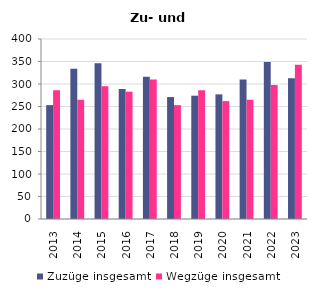
| Category | Zuzüge insgesamt | Wegzüge insgesamt |
|---|---|---|
| 2013.0 | 253 | 286 |
| 2014.0 | 334 | 265 |
| 2015.0 | 346 | 295 |
| 2016.0 | 289 | 283 |
| 2017.0 | 316 | 310 |
| 2018.0 | 271 | 253 |
| 2019.0 | 274 | 286 |
| 2020.0 | 277 | 262 |
| 2021.0 | 310 | 265 |
| 2022.0 | 349 | 298 |
| 2023.0 | 313 | 343 |